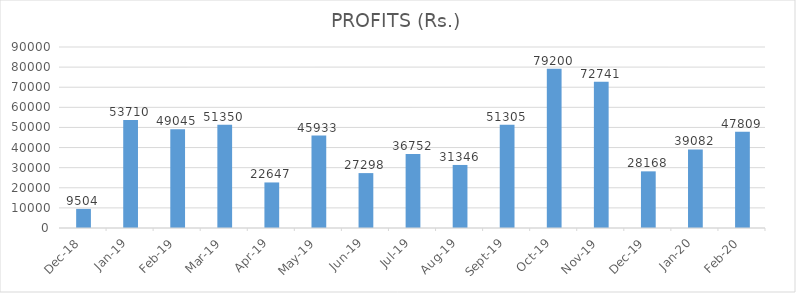
| Category | PROFITS (Rs.) |
|---|---|
| 2020-02-01 | 47809 |
| 2020-01-01 | 39082 |
| 2019-12-01 | 28168 |
| 2019-11-01 | 72741 |
| 2019-10-01 | 79200 |
| 2019-09-01 | 51305 |
| 2019-08-01 | 31346 |
| 2019-07-01 | 36752 |
| 2019-06-01 | 27298 |
| 2019-05-01 | 45933 |
| 2019-04-01 | 22647 |
| 2019-03-01 | 51350 |
| 2019-02-01 | 49045 |
| 2019-01-01 | 53710 |
| 2018-12-01 | 9504 |